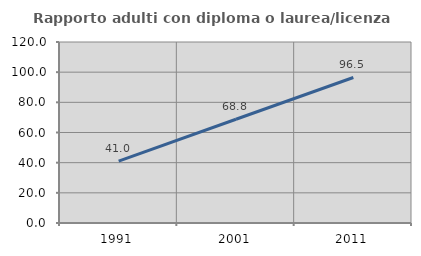
| Category | Rapporto adulti con diploma o laurea/licenza media  |
|---|---|
| 1991.0 | 41.041 |
| 2001.0 | 68.781 |
| 2011.0 | 96.472 |